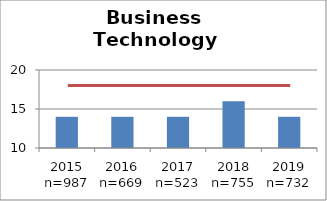
| Category | Scores |
|---|---|
| 2015 n=987 | 14 |
| 2016 n=669 | 14 |
| 2017 n=523 | 14 |
| 2018 n=755 | 16 |
| 2019 n=732 | 14 |